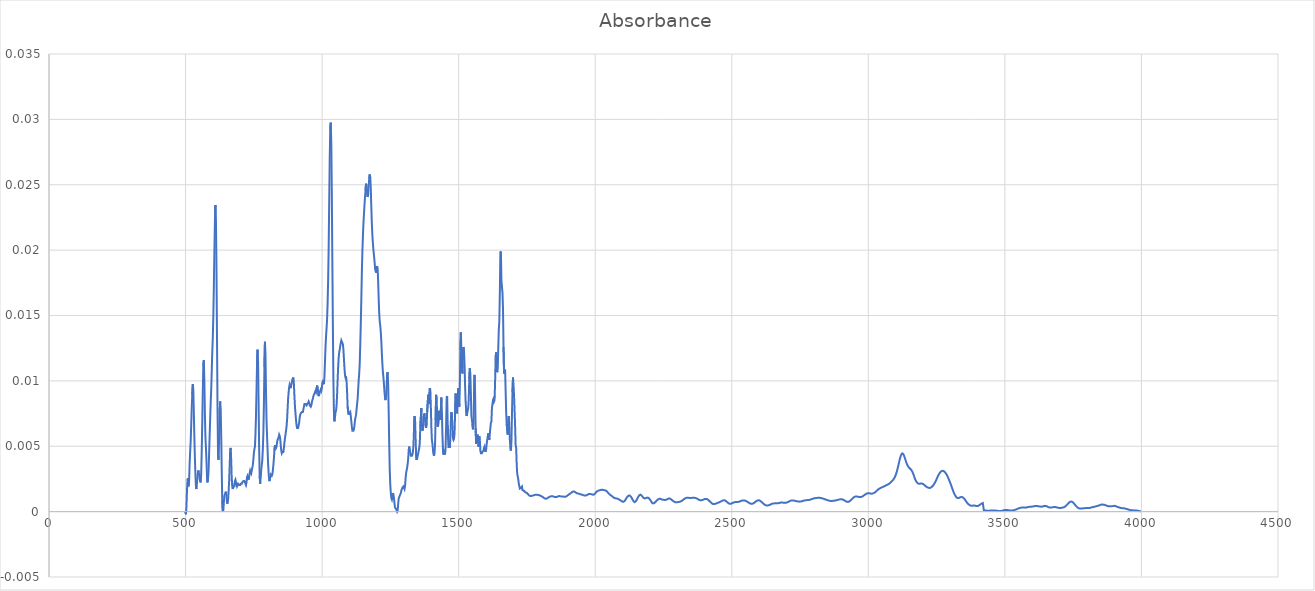
| Category | Absorbance |
|---|---|
| 3997.70514 | 0 |
| 3995.77668 | 0 |
| 3993.84822 | 0 |
| 3991.91975 | 0 |
| 3989.99129 | 0 |
| 3988.06283 | 0 |
| 3986.13436 | 0 |
| 3984.2059 | 0 |
| 3982.27743 | 0 |
| 3980.34897 | 0 |
| 3978.42051 | 0 |
| 3976.49204 | 0 |
| 3974.56358 | 0 |
| 3972.63512 | 0 |
| 3970.70665 | 0 |
| 3968.77819 | 0 |
| 3966.84973 | 0 |
| 3964.92126 | 0 |
| 3962.9928 | 0 |
| 3961.06433 | 0 |
| 3959.13587 | 0 |
| 3957.20741 | 0 |
| 3955.27894 | 0 |
| 3953.35048 | 0 |
| 3951.42202 | 0 |
| 3949.49355 | 0 |
| 3947.56509 | 0 |
| 3945.63663 | 0 |
| 3943.70816 | 0 |
| 3941.7797 | 0 |
| 3939.85123 | 0 |
| 3937.92277 | 0 |
| 3935.99431 | 0 |
| 3934.06584 | 0 |
| 3932.13738 | 0 |
| 3930.20892 | 0 |
| 3928.28045 | 0 |
| 3926.35199 | 0 |
| 3924.42353 | 0 |
| 3922.49506 | 0 |
| 3920.5666 | 0 |
| 3918.63813 | 0 |
| 3916.70967 | 0 |
| 3914.78121 | 0 |
| 3912.85274 | 0 |
| 3910.92428 | 0 |
| 3908.99582 | 0 |
| 3907.06735 | 0 |
| 3905.13889 | 0 |
| 3903.21043 | 0 |
| 3901.28196 | 0 |
| 3899.3535 | 0 |
| 3897.42503 | 0 |
| 3895.49657 | 0 |
| 3893.56811 | 0 |
| 3891.63964 | 0 |
| 3889.71118 | 0 |
| 3887.78272 | 0 |
| 3885.85425 | 0 |
| 3883.92579 | 0 |
| 3881.99733 | 0 |
| 3880.06886 | 0 |
| 3878.1404 | 0 |
| 3876.21193 | 0 |
| 3874.28347 | 0 |
| 3872.35501 | 0 |
| 3870.42654 | 0 |
| 3868.49808 | 0 |
| 3866.56962 | 0.001 |
| 3864.64115 | 0.001 |
| 3862.71269 | 0.001 |
| 3860.78422 | 0.001 |
| 3858.85576 | 0.001 |
| 3856.9273 | 0.001 |
| 3854.99883 | 0.001 |
| 3853.07037 | 0.001 |
| 3851.14191 | 0.001 |
| 3849.21344 | 0.001 |
| 3847.28498 | 0 |
| 3845.35652 | 0 |
| 3843.42805 | 0 |
| 3841.49959 | 0 |
| 3839.57112 | 0 |
| 3837.64266 | 0 |
| 3835.7142 | 0 |
| 3833.78573 | 0 |
| 3831.85727 | 0 |
| 3829.92881 | 0 |
| 3828.00034 | 0 |
| 3826.07188 | 0 |
| 3824.14342 | 0 |
| 3822.21495 | 0 |
| 3820.28649 | 0 |
| 3818.35802 | 0 |
| 3816.42956 | 0 |
| 3814.5011 | 0 |
| 3812.57263 | 0 |
| 3810.64417 | 0 |
| 3808.71571 | 0 |
| 3806.78724 | 0 |
| 3804.85878 | 0 |
| 3802.93032 | 0 |
| 3801.00185 | 0 |
| 3799.07339 | 0 |
| 3797.14492 | 0 |
| 3795.21646 | 0 |
| 3793.288 | 0 |
| 3791.35953 | 0 |
| 3789.43107 | 0 |
| 3787.50261 | 0 |
| 3785.57414 | 0 |
| 3783.64568 | 0 |
| 3781.71722 | 0 |
| 3779.78875 | 0 |
| 3777.86029 | 0 |
| 3775.93182 | 0 |
| 3774.00336 | 0 |
| 3772.0749 | 0 |
| 3770.14643 | 0 |
| 3768.21797 | 0 |
| 3766.28951 | 0 |
| 3764.36104 | 0 |
| 3762.43258 | 0 |
| 3760.50412 | 0 |
| 3758.57565 | 0 |
| 3756.64719 | 0.001 |
| 3754.71872 | 0.001 |
| 3752.79026 | 0.001 |
| 3750.8618 | 0.001 |
| 3748.93333 | 0.001 |
| 3747.00487 | 0.001 |
| 3745.07641 | 0.001 |
| 3743.14794 | 0.001 |
| 3741.21948 | 0.001 |
| 3739.29102 | 0.001 |
| 3737.36255 | 0.001 |
| 3735.43409 | 0.001 |
| 3733.50562 | 0.001 |
| 3731.57716 | 0.001 |
| 3729.6487 | 0.001 |
| 3727.72023 | 0.001 |
| 3725.79177 | 0 |
| 3723.86331 | 0 |
| 3721.93484 | 0 |
| 3720.00638 | 0 |
| 3718.07791 | 0 |
| 3716.14945 | 0 |
| 3714.22099 | 0 |
| 3712.29252 | 0 |
| 3710.36406 | 0 |
| 3708.4356 | 0 |
| 3706.50713 | 0 |
| 3704.57867 | 0 |
| 3702.65021 | 0 |
| 3700.72174 | 0 |
| 3698.79328 | 0 |
| 3696.86481 | 0 |
| 3694.93635 | 0 |
| 3693.00789 | 0 |
| 3691.07942 | 0 |
| 3689.15096 | 0 |
| 3687.2225 | 0 |
| 3685.29403 | 0 |
| 3683.36557 | 0 |
| 3681.43711 | 0 |
| 3679.50864 | 0 |
| 3677.58018 | 0 |
| 3675.65171 | 0 |
| 3673.72325 | 0 |
| 3671.79479 | 0 |
| 3669.86632 | 0 |
| 3667.93786 | 0 |
| 3666.0094 | 0 |
| 3664.08093 | 0 |
| 3662.15247 | 0 |
| 3660.22401 | 0 |
| 3658.29554 | 0 |
| 3656.36708 | 0 |
| 3654.43861 | 0 |
| 3652.51015 | 0 |
| 3650.58169 | 0 |
| 3648.65322 | 0 |
| 3646.72476 | 0 |
| 3644.7963 | 0 |
| 3642.86783 | 0 |
| 3640.93937 | 0 |
| 3639.01091 | 0 |
| 3637.08244 | 0 |
| 3635.15398 | 0 |
| 3633.22551 | 0 |
| 3631.29705 | 0 |
| 3629.36859 | 0 |
| 3627.44012 | 0 |
| 3625.51166 | 0 |
| 3623.5832 | 0 |
| 3621.65473 | 0 |
| 3619.72627 | 0 |
| 3617.79781 | 0 |
| 3615.86934 | 0 |
| 3613.94088 | 0 |
| 3612.01241 | 0 |
| 3610.08395 | 0 |
| 3608.15549 | 0 |
| 3606.22702 | 0 |
| 3604.29856 | 0 |
| 3602.3701 | 0 |
| 3600.44163 | 0 |
| 3598.51317 | 0 |
| 3596.58471 | 0 |
| 3594.65624 | 0 |
| 3592.72778 | 0 |
| 3590.79931 | 0 |
| 3588.87085 | 0 |
| 3586.94239 | 0 |
| 3585.01392 | 0 |
| 3583.08546 | 0 |
| 3581.157 | 0 |
| 3579.22853 | 0 |
| 3577.30007 | 0 |
| 3575.3716 | 0 |
| 3573.44314 | 0 |
| 3571.51468 | 0 |
| 3569.58621 | 0 |
| 3567.65775 | 0 |
| 3565.72929 | 0 |
| 3563.80082 | 0 |
| 3561.87236 | 0 |
| 3559.9439 | 0 |
| 3558.01543 | 0 |
| 3556.08697 | 0 |
| 3554.1585 | 0 |
| 3552.23004 | 0 |
| 3550.30158 | 0 |
| 3548.37311 | 0 |
| 3546.44465 | 0 |
| 3544.51619 | 0 |
| 3542.58772 | 0 |
| 3540.65926 | 0 |
| 3538.7308 | 0 |
| 3536.80233 | 0 |
| 3534.87387 | 0 |
| 3532.9454 | 0 |
| 3531.01694 | 0 |
| 3529.08848 | 0 |
| 3527.16001 | 0 |
| 3525.23155 | 0 |
| 3523.30309 | 0 |
| 3521.37462 | 0 |
| 3519.44616 | 0 |
| 3517.5177 | 0 |
| 3515.58923 | 0 |
| 3513.66077 | 0 |
| 3511.7323 | 0 |
| 3509.80384 | 0 |
| 3507.87538 | 0 |
| 3505.94691 | 0 |
| 3504.01845 | 0 |
| 3502.08999 | 0 |
| 3500.16152 | 0 |
| 3498.23306 | 0 |
| 3496.3046 | 0 |
| 3494.37613 | 0 |
| 3492.44767 | 0 |
| 3490.5192 | 0 |
| 3488.59074 | 0 |
| 3486.66228 | 0 |
| 3484.73381 | 0 |
| 3482.80535 | 0 |
| 3480.87689 | 0 |
| 3478.94842 | 0 |
| 3477.01996 | 0 |
| 3475.0915 | 0 |
| 3473.16303 | 0 |
| 3471.23457 | 0 |
| 3469.3061 | 0 |
| 3467.37764 | 0 |
| 3465.44918 | 0 |
| 3463.52071 | 0 |
| 3461.59225 | 0 |
| 3459.66379 | 0 |
| 3457.73532 | 0 |
| 3455.80686 | 0 |
| 3453.8784 | 0 |
| 3451.94993 | 0 |
| 3450.02147 | 0 |
| 3448.093 | 0 |
| 3446.16454 | 0 |
| 3444.23608 | 0 |
| 3442.30761 | 0 |
| 3440.37915 | 0 |
| 3438.45069 | 0 |
| 3436.52222 | 0 |
| 3434.59376 | 0 |
| 3432.66529 | 0 |
| 3430.73683 | 0 |
| 3428.80837 | 0 |
| 3426.8799 | 0 |
| 3424.95144 | 0 |
| 3423.02298 | 0 |
| 3421.09451 | 0 |
| 3419.16605 | 0.001 |
| 3417.23759 | 0.001 |
| 3415.30912 | 0.001 |
| 3413.38066 | 0.001 |
| 3411.45219 | 0.001 |
| 3409.52373 | 0.001 |
| 3407.59527 | 0.001 |
| 3405.6668 | 0 |
| 3403.73834 | 0 |
| 3401.80988 | 0 |
| 3399.88141 | 0 |
| 3397.95295 | 0 |
| 3396.02449 | 0 |
| 3394.09602 | 0 |
| 3392.16756 | 0 |
| 3390.23909 | 0 |
| 3388.31063 | 0 |
| 3386.38217 | 0 |
| 3384.4537 | 0 |
| 3382.52524 | 0 |
| 3380.59678 | 0 |
| 3378.66831 | 0 |
| 3376.73985 | 0 |
| 3374.81139 | 0 |
| 3372.88292 | 0 |
| 3370.95446 | 0.001 |
| 3369.02599 | 0.001 |
| 3367.09753 | 0.001 |
| 3365.16907 | 0.001 |
| 3363.2406 | 0.001 |
| 3361.31214 | 0.001 |
| 3359.38368 | 0.001 |
| 3357.45521 | 0.001 |
| 3355.52675 | 0.001 |
| 3353.59829 | 0.001 |
| 3351.66982 | 0.001 |
| 3349.74136 | 0.001 |
| 3347.81289 | 0.001 |
| 3345.88443 | 0.001 |
| 3343.95597 | 0.001 |
| 3342.0275 | 0.001 |
| 3340.09904 | 0.001 |
| 3338.17058 | 0.001 |
| 3336.24211 | 0.001 |
| 3334.31365 | 0.001 |
| 3332.38519 | 0.001 |
| 3330.45672 | 0.001 |
| 3328.52826 | 0.001 |
| 3326.59979 | 0.001 |
| 3324.67133 | 0.001 |
| 3322.74287 | 0.001 |
| 3320.8144 | 0.001 |
| 3318.88594 | 0.001 |
| 3316.95748 | 0.001 |
| 3315.02901 | 0.001 |
| 3313.10055 | 0.001 |
| 3311.17208 | 0.002 |
| 3309.24362 | 0.002 |
| 3307.31516 | 0.002 |
| 3305.38669 | 0.002 |
| 3303.45823 | 0.002 |
| 3301.52977 | 0.002 |
| 3299.6013 | 0.002 |
| 3297.67284 | 0.002 |
| 3295.74438 | 0.002 |
| 3293.81591 | 0.003 |
| 3291.88745 | 0.003 |
| 3289.95898 | 0.003 |
| 3288.03052 | 0.003 |
| 3286.10206 | 0.003 |
| 3284.17359 | 0.003 |
| 3282.24513 | 0.003 |
| 3280.31667 | 0.003 |
| 3278.3882 | 0.003 |
| 3276.45974 | 0.003 |
| 3274.53128 | 0.003 |
| 3272.60281 | 0.003 |
| 3270.67435 | 0.003 |
| 3268.74588 | 0.003 |
| 3266.81742 | 0.003 |
| 3264.88896 | 0.003 |
| 3262.96049 | 0.003 |
| 3261.03203 | 0.003 |
| 3259.10357 | 0.003 |
| 3257.1751 | 0.003 |
| 3255.24664 | 0.003 |
| 3253.31818 | 0.003 |
| 3251.38971 | 0.003 |
| 3249.46125 | 0.002 |
| 3247.53278 | 0.002 |
| 3245.60432 | 0.002 |
| 3243.67586 | 0.002 |
| 3241.74739 | 0.002 |
| 3239.81893 | 0.002 |
| 3237.89047 | 0.002 |
| 3235.962 | 0.002 |
| 3234.03354 | 0.002 |
| 3232.10508 | 0.002 |
| 3230.17661 | 0.002 |
| 3228.24815 | 0.002 |
| 3226.31968 | 0.002 |
| 3224.39122 | 0.002 |
| 3222.46276 | 0.002 |
| 3220.53429 | 0.002 |
| 3218.60583 | 0.002 |
| 3216.67737 | 0.002 |
| 3214.7489 | 0.002 |
| 3212.82044 | 0.002 |
| 3210.89198 | 0.002 |
| 3208.96351 | 0.002 |
| 3207.03505 | 0.002 |
| 3205.10658 | 0.002 |
| 3203.17812 | 0.002 |
| 3201.24966 | 0.002 |
| 3199.32119 | 0.002 |
| 3197.39273 | 0.002 |
| 3195.46427 | 0.002 |
| 3193.5358 | 0.002 |
| 3191.60734 | 0.002 |
| 3189.67888 | 0.002 |
| 3187.75041 | 0.002 |
| 3185.82195 | 0.002 |
| 3183.89348 | 0.002 |
| 3181.96502 | 0.002 |
| 3180.03656 | 0.002 |
| 3178.10809 | 0.002 |
| 3176.17963 | 0.002 |
| 3174.25117 | 0.002 |
| 3172.3227 | 0.002 |
| 3170.39424 | 0.003 |
| 3168.46577 | 0.003 |
| 3166.53731 | 0.003 |
| 3164.60885 | 0.003 |
| 3162.68038 | 0.003 |
| 3160.75192 | 0.003 |
| 3158.82346 | 0.003 |
| 3156.89499 | 0.003 |
| 3154.96653 | 0.003 |
| 3153.03807 | 0.003 |
| 3151.1096 | 0.003 |
| 3149.18114 | 0.003 |
| 3147.25267 | 0.003 |
| 3145.32421 | 0.003 |
| 3143.39575 | 0.004 |
| 3141.46728 | 0.004 |
| 3139.53882 | 0.004 |
| 3137.61036 | 0.004 |
| 3135.68189 | 0.004 |
| 3133.75343 | 0.004 |
| 3131.82497 | 0.004 |
| 3129.8965 | 0.004 |
| 3127.96804 | 0.004 |
| 3126.03957 | 0.004 |
| 3124.11111 | 0.004 |
| 3122.18265 | 0.004 |
| 3120.25418 | 0.004 |
| 3118.32572 | 0.004 |
| 3116.39726 | 0.004 |
| 3114.46879 | 0.004 |
| 3112.54033 | 0.004 |
| 3110.61187 | 0.004 |
| 3108.6834 | 0.003 |
| 3106.75494 | 0.003 |
| 3104.82647 | 0.003 |
| 3102.89801 | 0.003 |
| 3100.96955 | 0.003 |
| 3099.04108 | 0.003 |
| 3097.11262 | 0.003 |
| 3095.18416 | 0.003 |
| 3093.25569 | 0.003 |
| 3091.32723 | 0.002 |
| 3089.39877 | 0.002 |
| 3087.4703 | 0.002 |
| 3085.54184 | 0.002 |
| 3083.61337 | 0.002 |
| 3081.68491 | 0.002 |
| 3079.75645 | 0.002 |
| 3077.82798 | 0.002 |
| 3075.89952 | 0.002 |
| 3073.97106 | 0.002 |
| 3072.04259 | 0.002 |
| 3070.11413 | 0.002 |
| 3068.18567 | 0.002 |
| 3066.2572 | 0.002 |
| 3064.32874 | 0.002 |
| 3062.40027 | 0.002 |
| 3060.47181 | 0.002 |
| 3058.54335 | 0.002 |
| 3056.61488 | 0.002 |
| 3054.68642 | 0.002 |
| 3052.75796 | 0.002 |
| 3050.82949 | 0.002 |
| 3048.90103 | 0.002 |
| 3046.97257 | 0.002 |
| 3045.0441 | 0.002 |
| 3043.11564 | 0.002 |
| 3041.18717 | 0.002 |
| 3039.25871 | 0.002 |
| 3037.33025 | 0.002 |
| 3035.40178 | 0.002 |
| 3033.47332 | 0.002 |
| 3031.54486 | 0.002 |
| 3029.61639 | 0.002 |
| 3027.68793 | 0.002 |
| 3025.75946 | 0.001 |
| 3023.831 | 0.001 |
| 3021.90254 | 0.001 |
| 3019.97407 | 0.001 |
| 3018.04561 | 0.001 |
| 3016.11715 | 0.001 |
| 3014.18868 | 0.001 |
| 3012.26022 | 0.001 |
| 3010.33176 | 0.001 |
| 3008.40329 | 0.001 |
| 3006.47483 | 0.001 |
| 3004.54636 | 0.001 |
| 3002.6179 | 0.001 |
| 3000.68944 | 0.001 |
| 2998.76097 | 0.001 |
| 2996.83251 | 0.001 |
| 2994.90405 | 0.001 |
| 2992.97558 | 0.001 |
| 2991.04712 | 0.001 |
| 2989.11866 | 0.001 |
| 2987.19019 | 0.001 |
| 2985.26173 | 0.001 |
| 2983.33326 | 0.001 |
| 2981.4048 | 0.001 |
| 2979.47634 | 0.001 |
| 2977.54787 | 0.001 |
| 2975.61941 | 0.001 |
| 2973.69095 | 0.001 |
| 2971.76248 | 0.001 |
| 2969.83402 | 0.001 |
| 2967.90556 | 0.001 |
| 2965.97709 | 0.001 |
| 2964.04863 | 0.001 |
| 2962.12016 | 0.001 |
| 2960.1917 | 0.001 |
| 2958.26324 | 0.001 |
| 2956.33477 | 0.001 |
| 2954.40631 | 0.001 |
| 2952.47785 | 0.001 |
| 2950.54938 | 0.001 |
| 2948.62092 | 0.001 |
| 2946.69246 | 0.001 |
| 2944.76399 | 0.001 |
| 2942.83553 | 0.001 |
| 2940.90706 | 0.001 |
| 2938.9786 | 0.001 |
| 2937.05014 | 0.001 |
| 2935.12167 | 0.001 |
| 2933.19321 | 0.001 |
| 2931.26475 | 0.001 |
| 2929.33628 | 0.001 |
| 2927.40782 | 0.001 |
| 2925.47936 | 0.001 |
| 2923.55089 | 0.001 |
| 2921.62243 | 0.001 |
| 2919.69396 | 0.001 |
| 2917.7655 | 0.001 |
| 2915.83704 | 0.001 |
| 2913.90857 | 0.001 |
| 2911.98011 | 0.001 |
| 2910.05165 | 0.001 |
| 2908.12318 | 0.001 |
| 2906.19472 | 0.001 |
| 2904.26626 | 0.001 |
| 2902.33779 | 0.001 |
| 2900.40933 | 0.001 |
| 2898.48086 | 0.001 |
| 2896.5524 | 0.001 |
| 2894.62394 | 0.001 |
| 2892.69547 | 0.001 |
| 2890.76701 | 0.001 |
| 2888.83855 | 0.001 |
| 2886.91008 | 0.001 |
| 2884.98162 | 0.001 |
| 2883.05315 | 0.001 |
| 2881.12469 | 0.001 |
| 2879.19623 | 0.001 |
| 2877.26776 | 0.001 |
| 2875.3393 | 0.001 |
| 2873.41084 | 0.001 |
| 2871.48237 | 0.001 |
| 2869.55391 | 0.001 |
| 2867.62545 | 0.001 |
| 2865.69698 | 0.001 |
| 2863.76852 | 0.001 |
| 2861.84005 | 0.001 |
| 2859.91159 | 0.001 |
| 2857.98313 | 0.001 |
| 2856.05466 | 0.001 |
| 2854.1262 | 0.001 |
| 2852.19774 | 0.001 |
| 2850.26927 | 0.001 |
| 2848.34081 | 0.001 |
| 2846.41235 | 0.001 |
| 2844.48388 | 0.001 |
| 2842.55542 | 0.001 |
| 2840.62695 | 0.001 |
| 2838.69849 | 0.001 |
| 2836.77003 | 0.001 |
| 2834.84156 | 0.001 |
| 2832.9131 | 0.001 |
| 2830.98464 | 0.001 |
| 2829.05617 | 0.001 |
| 2827.12771 | 0.001 |
| 2825.19925 | 0.001 |
| 2823.27078 | 0.001 |
| 2821.34232 | 0.001 |
| 2819.41385 | 0.001 |
| 2817.48539 | 0.001 |
| 2815.55693 | 0.001 |
| 2813.62846 | 0.001 |
| 2811.7 | 0.001 |
| 2809.77154 | 0.001 |
| 2807.84307 | 0.001 |
| 2805.91461 | 0.001 |
| 2803.98615 | 0.001 |
| 2802.05768 | 0.001 |
| 2800.12922 | 0.001 |
| 2798.20075 | 0.001 |
| 2796.27229 | 0.001 |
| 2794.34383 | 0.001 |
| 2792.41536 | 0.001 |
| 2790.4869 | 0.001 |
| 2788.55844 | 0.001 |
| 2786.62997 | 0.001 |
| 2784.70151 | 0.001 |
| 2782.77305 | 0.001 |
| 2780.84458 | 0.001 |
| 2778.91612 | 0.001 |
| 2776.98765 | 0.001 |
| 2775.05919 | 0.001 |
| 2773.13073 | 0.001 |
| 2771.20226 | 0.001 |
| 2769.2738 | 0.001 |
| 2767.34534 | 0.001 |
| 2765.41687 | 0.001 |
| 2763.48841 | 0.001 |
| 2761.55995 | 0.001 |
| 2759.63148 | 0.001 |
| 2757.70302 | 0.001 |
| 2755.77455 | 0.001 |
| 2753.84609 | 0.001 |
| 2751.91763 | 0.001 |
| 2749.98916 | 0.001 |
| 2748.0607 | 0.001 |
| 2746.13224 | 0.001 |
| 2744.20377 | 0.001 |
| 2742.27531 | 0.001 |
| 2740.34684 | 0.001 |
| 2738.41838 | 0.001 |
| 2736.48992 | 0.001 |
| 2734.56145 | 0.001 |
| 2732.63299 | 0.001 |
| 2730.70453 | 0.001 |
| 2728.77606 | 0.001 |
| 2726.8476 | 0.001 |
| 2724.91914 | 0.001 |
| 2722.99067 | 0.001 |
| 2721.06221 | 0.001 |
| 2719.13374 | 0.001 |
| 2717.20528 | 0.001 |
| 2715.27682 | 0.001 |
| 2713.34835 | 0.001 |
| 2711.41989 | 0.001 |
| 2709.49143 | 0.001 |
| 2707.56296 | 0.001 |
| 2705.6345 | 0.001 |
| 2703.70604 | 0.001 |
| 2701.77757 | 0.001 |
| 2699.84911 | 0.001 |
| 2697.92064 | 0.001 |
| 2695.99218 | 0.001 |
| 2694.06372 | 0.001 |
| 2692.13525 | 0.001 |
| 2690.20679 | 0.001 |
| 2688.27833 | 0.001 |
| 2686.34986 | 0.001 |
| 2684.4214 | 0.001 |
| 2682.49294 | 0.001 |
| 2680.56447 | 0.001 |
| 2678.63601 | 0.001 |
| 2676.70754 | 0.001 |
| 2674.77908 | 0.001 |
| 2672.85062 | 0.001 |
| 2670.92215 | 0.001 |
| 2668.99369 | 0.001 |
| 2667.06523 | 0.001 |
| 2665.13676 | 0.001 |
| 2663.2083 | 0.001 |
| 2661.27984 | 0.001 |
| 2659.35137 | 0.001 |
| 2657.42291 | 0.001 |
| 2655.49444 | 0.001 |
| 2653.56598 | 0.001 |
| 2651.63752 | 0.001 |
| 2649.70905 | 0.001 |
| 2647.78059 | 0.001 |
| 2645.85213 | 0.001 |
| 2643.92366 | 0.001 |
| 2641.9952 | 0.001 |
| 2640.06674 | 0.001 |
| 2638.13827 | 0.001 |
| 2636.20981 | 0 |
| 2634.28134 | 0 |
| 2632.35288 | 0 |
| 2630.42442 | 0 |
| 2628.49595 | 0 |
| 2626.56749 | 0 |
| 2624.63903 | 0 |
| 2622.71056 | 0.001 |
| 2620.7821 | 0.001 |
| 2618.85364 | 0.001 |
| 2616.92517 | 0.001 |
| 2614.99671 | 0.001 |
| 2613.06824 | 0.001 |
| 2611.13978 | 0.001 |
| 2609.21132 | 0.001 |
| 2607.28285 | 0.001 |
| 2605.35439 | 0.001 |
| 2603.42593 | 0.001 |
| 2601.49746 | 0.001 |
| 2599.569 | 0.001 |
| 2597.64053 | 0.001 |
| 2595.71207 | 0.001 |
| 2593.78361 | 0.001 |
| 2591.85514 | 0.001 |
| 2589.92668 | 0.001 |
| 2587.99822 | 0.001 |
| 2586.06975 | 0.001 |
| 2584.14129 | 0.001 |
| 2582.21283 | 0.001 |
| 2580.28436 | 0.001 |
| 2578.3559 | 0.001 |
| 2576.42743 | 0.001 |
| 2574.49897 | 0.001 |
| 2572.57051 | 0.001 |
| 2570.64204 | 0.001 |
| 2568.71358 | 0.001 |
| 2566.78512 | 0.001 |
| 2564.85665 | 0.001 |
| 2562.92819 | 0.001 |
| 2560.99973 | 0.001 |
| 2559.07126 | 0.001 |
| 2557.1428 | 0.001 |
| 2555.21433 | 0.001 |
| 2553.28587 | 0.001 |
| 2551.35741 | 0.001 |
| 2549.42894 | 0.001 |
| 2547.50048 | 0.001 |
| 2545.57202 | 0.001 |
| 2543.64355 | 0.001 |
| 2541.71509 | 0.001 |
| 2539.78663 | 0.001 |
| 2537.85816 | 0.001 |
| 2535.9297 | 0.001 |
| 2534.00123 | 0.001 |
| 2532.07277 | 0.001 |
| 2530.14431 | 0.001 |
| 2528.21584 | 0.001 |
| 2526.28738 | 0.001 |
| 2524.35892 | 0.001 |
| 2522.43045 | 0.001 |
| 2520.50199 | 0.001 |
| 2518.57353 | 0.001 |
| 2516.64506 | 0.001 |
| 2514.7166 | 0.001 |
| 2512.78813 | 0.001 |
| 2510.85967 | 0.001 |
| 2508.93121 | 0.001 |
| 2507.00274 | 0.001 |
| 2505.07428 | 0.001 |
| 2503.14582 | 0.001 |
| 2501.21735 | 0.001 |
| 2499.28889 | 0.001 |
| 2497.36043 | 0.001 |
| 2495.43196 | 0.001 |
| 2493.5035 | 0.001 |
| 2491.57503 | 0.001 |
| 2489.64657 | 0.001 |
| 2487.71811 | 0.001 |
| 2485.78964 | 0.001 |
| 2483.86118 | 0.001 |
| 2481.93272 | 0.001 |
| 2480.00425 | 0.001 |
| 2478.07579 | 0.001 |
| 2476.14733 | 0.001 |
| 2474.21886 | 0.001 |
| 2472.2904 | 0.001 |
| 2470.36193 | 0.001 |
| 2468.43347 | 0.001 |
| 2466.50501 | 0.001 |
| 2464.57654 | 0.001 |
| 2462.64808 | 0.001 |
| 2460.71962 | 0.001 |
| 2458.79115 | 0.001 |
| 2456.86269 | 0.001 |
| 2454.93422 | 0.001 |
| 2453.00576 | 0.001 |
| 2451.0773 | 0.001 |
| 2449.14883 | 0.001 |
| 2447.22037 | 0.001 |
| 2445.29191 | 0.001 |
| 2443.36344 | 0.001 |
| 2441.43498 | 0.001 |
| 2439.50652 | 0.001 |
| 2437.57805 | 0.001 |
| 2435.64959 | 0.001 |
| 2433.72112 | 0.001 |
| 2431.79266 | 0.001 |
| 2429.8642 | 0.001 |
| 2427.93573 | 0.001 |
| 2426.00727 | 0.001 |
| 2424.07881 | 0.001 |
| 2422.15034 | 0.001 |
| 2420.22188 | 0.001 |
| 2418.29342 | 0.001 |
| 2416.36495 | 0.001 |
| 2414.43649 | 0.001 |
| 2412.50802 | 0.001 |
| 2410.57956 | 0.001 |
| 2408.6511 | 0.001 |
| 2406.72263 | 0.001 |
| 2404.79417 | 0.001 |
| 2402.86571 | 0.001 |
| 2400.93724 | 0.001 |
| 2399.00878 | 0.001 |
| 2397.08032 | 0.001 |
| 2395.15185 | 0.001 |
| 2393.22339 | 0.001 |
| 2391.29492 | 0.001 |
| 2389.36646 | 0.001 |
| 2387.438 | 0.001 |
| 2385.50953 | 0.001 |
| 2383.58107 | 0.001 |
| 2381.65261 | 0.001 |
| 2379.72414 | 0.001 |
| 2377.79568 | 0.001 |
| 2375.86722 | 0.001 |
| 2373.93875 | 0.001 |
| 2372.01029 | 0.001 |
| 2370.08182 | 0.001 |
| 2368.15336 | 0.001 |
| 2366.2249 | 0.001 |
| 2364.29643 | 0.001 |
| 2362.36797 | 0.001 |
| 2360.43951 | 0.001 |
| 2358.51104 | 0.001 |
| 2356.58258 | 0.001 |
| 2354.65412 | 0.001 |
| 2352.72565 | 0.001 |
| 2350.79719 | 0.001 |
| 2348.86872 | 0.001 |
| 2346.94026 | 0.001 |
| 2345.0118 | 0.001 |
| 2343.08333 | 0.001 |
| 2341.15487 | 0.001 |
| 2339.22641 | 0.001 |
| 2337.29794 | 0.001 |
| 2335.36948 | 0.001 |
| 2333.44102 | 0.001 |
| 2331.51255 | 0.001 |
| 2329.58409 | 0.001 |
| 2327.65562 | 0.001 |
| 2325.72716 | 0.001 |
| 2323.7987 | 0.001 |
| 2321.87023 | 0.001 |
| 2319.94177 | 0.001 |
| 2318.01331 | 0.001 |
| 2316.08484 | 0.001 |
| 2314.15638 | 0.001 |
| 2312.22791 | 0.001 |
| 2310.29945 | 0.001 |
| 2308.37099 | 0.001 |
| 2306.44252 | 0.001 |
| 2304.51406 | 0.001 |
| 2302.5856 | 0.001 |
| 2300.65713 | 0.001 |
| 2298.72867 | 0.001 |
| 2296.80021 | 0.001 |
| 2294.87174 | 0.001 |
| 2292.94328 | 0.001 |
| 2291.01481 | 0.001 |
| 2289.08635 | 0.001 |
| 2287.15789 | 0.001 |
| 2285.22942 | 0.001 |
| 2283.30096 | 0.001 |
| 2281.3725 | 0.001 |
| 2279.44403 | 0.001 |
| 2277.51557 | 0.001 |
| 2275.58711 | 0.001 |
| 2273.65864 | 0.001 |
| 2271.73018 | 0.001 |
| 2269.80171 | 0.001 |
| 2267.87325 | 0.001 |
| 2265.94479 | 0.001 |
| 2264.01632 | 0.001 |
| 2262.08786 | 0.001 |
| 2260.1594 | 0.001 |
| 2258.23093 | 0.001 |
| 2256.30247 | 0.001 |
| 2254.37401 | 0.001 |
| 2252.44554 | 0.001 |
| 2250.51708 | 0.001 |
| 2248.58861 | 0.001 |
| 2246.66015 | 0.001 |
| 2244.73169 | 0.001 |
| 2242.80322 | 0.001 |
| 2240.87476 | 0.001 |
| 2238.9463 | 0.001 |
| 2237.01783 | 0.001 |
| 2235.08937 | 0.001 |
| 2233.16091 | 0.001 |
| 2231.23244 | 0.001 |
| 2229.30398 | 0.001 |
| 2227.37551 | 0.001 |
| 2225.44705 | 0.001 |
| 2223.51859 | 0.001 |
| 2221.59012 | 0.001 |
| 2219.66166 | 0.001 |
| 2217.7332 | 0.001 |
| 2215.80473 | 0.001 |
| 2213.87627 | 0.001 |
| 2211.94781 | 0.001 |
| 2210.01934 | 0.001 |
| 2208.09088 | 0.001 |
| 2206.16241 | 0.001 |
| 2204.23395 | 0.001 |
| 2202.30549 | 0.001 |
| 2200.37702 | 0.001 |
| 2198.44856 | 0.001 |
| 2196.5201 | 0.001 |
| 2194.59163 | 0.001 |
| 2192.66317 | 0.001 |
| 2190.73471 | 0.001 |
| 2188.80624 | 0.001 |
| 2186.87778 | 0.001 |
| 2184.94931 | 0.001 |
| 2183.02085 | 0.001 |
| 2181.09239 | 0.001 |
| 2179.16392 | 0.001 |
| 2177.23546 | 0.001 |
| 2175.307 | 0.001 |
| 2173.37853 | 0.001 |
| 2171.45007 | 0.001 |
| 2169.5216 | 0.001 |
| 2167.59314 | 0.001 |
| 2165.66468 | 0.001 |
| 2163.73621 | 0.001 |
| 2161.80775 | 0.001 |
| 2159.87929 | 0.001 |
| 2157.95082 | 0.001 |
| 2156.02236 | 0.001 |
| 2154.0939 | 0.001 |
| 2152.16543 | 0.001 |
| 2150.23697 | 0.001 |
| 2148.3085 | 0.001 |
| 2146.38004 | 0.001 |
| 2144.45158 | 0.001 |
| 2142.52311 | 0.001 |
| 2140.59465 | 0.001 |
| 2138.66619 | 0.001 |
| 2136.73772 | 0.001 |
| 2134.80926 | 0.001 |
| 2132.8808 | 0.001 |
| 2130.95233 | 0.001 |
| 2129.02387 | 0.001 |
| 2127.0954 | 0.001 |
| 2125.16694 | 0.001 |
| 2123.23848 | 0.001 |
| 2121.31001 | 0.001 |
| 2119.38155 | 0.001 |
| 2117.45309 | 0.001 |
| 2115.52462 | 0.001 |
| 2113.59616 | 0.001 |
| 2111.6677 | 0.001 |
| 2109.73923 | 0.001 |
| 2107.81077 | 0.001 |
| 2105.8823 | 0.001 |
| 2103.95384 | 0.001 |
| 2102.02538 | 0.001 |
| 2100.09691 | 0.001 |
| 2098.16845 | 0.001 |
| 2096.23999 | 0.001 |
| 2094.31152 | 0.001 |
| 2092.38306 | 0.001 |
| 2090.4546 | 0.001 |
| 2088.52613 | 0.001 |
| 2086.59767 | 0.001 |
| 2084.6692 | 0.001 |
| 2082.74074 | 0.001 |
| 2080.81228 | 0.001 |
| 2078.88381 | 0.001 |
| 2076.95535 | 0.001 |
| 2075.02689 | 0.001 |
| 2073.09842 | 0.001 |
| 2071.16996 | 0.001 |
| 2069.2415 | 0.001 |
| 2067.31303 | 0.001 |
| 2065.38457 | 0.001 |
| 2063.4561 | 0.001 |
| 2061.52764 | 0.001 |
| 2059.59918 | 0.001 |
| 2057.67071 | 0.001 |
| 2055.74225 | 0.001 |
| 2053.81379 | 0.001 |
| 2051.88532 | 0.001 |
| 2049.95686 | 0.001 |
| 2048.0284 | 0.001 |
| 2046.09993 | 0.001 |
| 2044.17147 | 0.002 |
| 2042.243 | 0.002 |
| 2040.31454 | 0.002 |
| 2038.38608 | 0.002 |
| 2036.45761 | 0.002 |
| 2034.52915 | 0.002 |
| 2032.60069 | 0.002 |
| 2030.67222 | 0.002 |
| 2028.74376 | 0.002 |
| 2026.81529 | 0.002 |
| 2024.88683 | 0.002 |
| 2022.95837 | 0.002 |
| 2021.0299 | 0.002 |
| 2019.10144 | 0.002 |
| 2017.17298 | 0.002 |
| 2015.24451 | 0.002 |
| 2013.31605 | 0.002 |
| 2011.38759 | 0.002 |
| 2009.45912 | 0.002 |
| 2007.53066 | 0.002 |
| 2005.60219 | 0.002 |
| 2003.67373 | 0.001 |
| 2001.74527 | 0.001 |
| 1999.8168 | 0.001 |
| 1997.88834 | 0.001 |
| 1995.95988 | 0.001 |
| 1994.03141 | 0.001 |
| 1992.10295 | 0.001 |
| 1990.17449 | 0.001 |
| 1988.24602 | 0.001 |
| 1986.31756 | 0.001 |
| 1984.38909 | 0.001 |
| 1982.46063 | 0.001 |
| 1980.53217 | 0.001 |
| 1978.6037 | 0.001 |
| 1976.67524 | 0.001 |
| 1974.74678 | 0.001 |
| 1972.81831 | 0.001 |
| 1970.88985 | 0.001 |
| 1968.96139 | 0.001 |
| 1967.03292 | 0.001 |
| 1965.10446 | 0.001 |
| 1963.17599 | 0.001 |
| 1961.24753 | 0.001 |
| 1959.31907 | 0.001 |
| 1957.3906 | 0.001 |
| 1955.46214 | 0.001 |
| 1953.53368 | 0.001 |
| 1951.60521 | 0.001 |
| 1949.67675 | 0.001 |
| 1947.74829 | 0.001 |
| 1945.81982 | 0.001 |
| 1943.89136 | 0.001 |
| 1941.96289 | 0.001 |
| 1940.03443 | 0.001 |
| 1938.10597 | 0.001 |
| 1936.1775 | 0.001 |
| 1934.24904 | 0.001 |
| 1932.32058 | 0.001 |
| 1930.39211 | 0.001 |
| 1928.46365 | 0.001 |
| 1926.53519 | 0.001 |
| 1924.60672 | 0.002 |
| 1922.67826 | 0.002 |
| 1920.74979 | 0.002 |
| 1918.82133 | 0.002 |
| 1916.89287 | 0.002 |
| 1914.9644 | 0.001 |
| 1913.03594 | 0.001 |
| 1911.10748 | 0.001 |
| 1909.17901 | 0.001 |
| 1907.25055 | 0.001 |
| 1905.32209 | 0.001 |
| 1903.39362 | 0.001 |
| 1901.46516 | 0.001 |
| 1899.53669 | 0.001 |
| 1897.60823 | 0.001 |
| 1895.67977 | 0.001 |
| 1893.7513 | 0.001 |
| 1891.82284 | 0.001 |
| 1889.89438 | 0.001 |
| 1887.96591 | 0.001 |
| 1886.03745 | 0.001 |
| 1884.10898 | 0.001 |
| 1882.18052 | 0.001 |
| 1880.25206 | 0.001 |
| 1878.32359 | 0.001 |
| 1876.39513 | 0.001 |
| 1874.46667 | 0.001 |
| 1872.5382 | 0.001 |
| 1870.60974 | 0.001 |
| 1868.68128 | 0.001 |
| 1866.75281 | 0.001 |
| 1864.82435 | 0.001 |
| 1862.89588 | 0.001 |
| 1860.96742 | 0.001 |
| 1859.03896 | 0.001 |
| 1857.11049 | 0.001 |
| 1855.18203 | 0.001 |
| 1853.25357 | 0.001 |
| 1851.3251 | 0.001 |
| 1849.39664 | 0.001 |
| 1847.46818 | 0.001 |
| 1845.53971 | 0.001 |
| 1843.61125 | 0.001 |
| 1841.68278 | 0.001 |
| 1839.75432 | 0.001 |
| 1837.82586 | 0.001 |
| 1835.89739 | 0.001 |
| 1833.96893 | 0.001 |
| 1832.04047 | 0.001 |
| 1830.112 | 0.001 |
| 1828.18354 | 0.001 |
| 1826.25508 | 0.001 |
| 1824.32661 | 0.001 |
| 1822.39815 | 0.001 |
| 1820.46968 | 0.001 |
| 1818.54122 | 0.001 |
| 1816.61276 | 0.001 |
| 1814.68429 | 0.001 |
| 1812.75583 | 0.001 |
| 1810.82737 | 0.001 |
| 1808.8989 | 0.001 |
| 1806.97044 | 0.001 |
| 1805.04198 | 0.001 |
| 1803.11351 | 0.001 |
| 1801.18505 | 0.001 |
| 1799.25658 | 0.001 |
| 1797.32812 | 0.001 |
| 1795.39966 | 0.001 |
| 1793.47119 | 0.001 |
| 1791.54273 | 0.001 |
| 1789.61427 | 0.001 |
| 1787.6858 | 0.001 |
| 1785.75734 | 0.001 |
| 1783.82888 | 0.001 |
| 1781.90041 | 0.001 |
| 1779.97195 | 0.001 |
| 1778.04348 | 0.001 |
| 1776.11502 | 0.001 |
| 1774.18656 | 0.001 |
| 1772.25809 | 0.001 |
| 1770.32963 | 0.001 |
| 1768.40117 | 0.001 |
| 1766.4727 | 0.001 |
| 1764.54424 | 0.001 |
| 1762.61578 | 0.001 |
| 1760.68731 | 0.001 |
| 1758.75885 | 0.001 |
| 1756.83038 | 0.001 |
| 1754.90192 | 0.001 |
| 1752.97346 | 0.001 |
| 1751.04499 | 0.001 |
| 1749.11653 | 0.001 |
| 1747.18807 | 0.001 |
| 1745.2596 | 0.001 |
| 1743.33114 | 0.001 |
| 1741.40267 | 0.002 |
| 1739.47421 | 0.002 |
| 1737.54575 | 0.002 |
| 1735.61728 | 0.002 |
| 1733.68882 | 0.002 |
| 1731.76036 | 0.002 |
| 1729.83189 | 0.002 |
| 1727.90343 | 0.002 |
| 1725.97497 | 0.002 |
| 1724.0465 | 0.002 |
| 1722.11804 | 0.002 |
| 1720.18957 | 0.002 |
| 1718.26111 | 0.002 |
| 1716.33265 | 0.003 |
| 1714.40418 | 0.003 |
| 1712.47572 | 0.004 |
| 1710.54726 | 0.005 |
| 1708.61879 | 0.005 |
| 1706.69033 | 0.007 |
| 1704.76187 | 0.008 |
| 1702.8334 | 0.009 |
| 1700.90494 | 0.01 |
| 1698.97647 | 0.01 |
| 1697.04801 | 0.009 |
| 1695.11955 | 0.007 |
| 1693.19108 | 0.005 |
| 1691.26262 | 0.005 |
| 1689.33416 | 0.005 |
| 1687.40569 | 0.005 |
| 1685.47723 | 0.007 |
| 1683.54877 | 0.007 |
| 1681.6203 | 0.007 |
| 1679.69184 | 0.006 |
| 1677.76337 | 0.006 |
| 1675.83491 | 0.007 |
| 1673.90645 | 0.008 |
| 1671.97798 | 0.009 |
| 1670.04952 | 0.011 |
| 1668.12106 | 0.011 |
| 1666.19259 | 0.011 |
| 1664.26413 | 0.013 |
| 1662.33567 | 0.016 |
| 1660.4072 | 0.017 |
| 1658.47874 | 0.017 |
| 1656.55027 | 0.018 |
| 1654.62181 | 0.02 |
| 1652.69335 | 0.02 |
| 1650.76488 | 0.017 |
| 1648.83642 | 0.015 |
| 1646.90796 | 0.014 |
| 1644.97949 | 0.012 |
| 1643.05103 | 0.011 |
| 1641.12257 | 0.011 |
| 1639.1941 | 0.011 |
| 1637.26564 | 0.012 |
| 1635.33717 | 0.012 |
| 1633.40871 | 0.01 |
| 1631.48025 | 0.009 |
| 1629.55178 | 0.008 |
| 1627.62332 | 0.009 |
| 1625.69486 | 0.009 |
| 1623.76639 | 0.009 |
| 1621.83793 | 0.008 |
| 1619.90946 | 0.007 |
| 1617.981 | 0.007 |
| 1616.05254 | 0.007 |
| 1614.12407 | 0.006 |
| 1612.19561 | 0.005 |
| 1610.26715 | 0.006 |
| 1608.33868 | 0.006 |
| 1606.41022 | 0.006 |
| 1604.48176 | 0.005 |
| 1602.55329 | 0.005 |
| 1600.62483 | 0.005 |
| 1598.69636 | 0.005 |
| 1596.7679 | 0.005 |
| 1594.83944 | 0.005 |
| 1592.91097 | 0.005 |
| 1590.98251 | 0.005 |
| 1589.05405 | 0.005 |
| 1587.12558 | 0.005 |
| 1585.19712 | 0.004 |
| 1583.26866 | 0.004 |
| 1581.34019 | 0.004 |
| 1579.41173 | 0.005 |
| 1577.48326 | 0.005 |
| 1575.5548 | 0.006 |
| 1573.62634 | 0.005 |
| 1571.69787 | 0.005 |
| 1569.76941 | 0.006 |
| 1567.84095 | 0.006 |
| 1565.91248 | 0.005 |
| 1563.98402 | 0.005 |
| 1562.05556 | 0.006 |
| 1560.12709 | 0.009 |
| 1558.19863 | 0.01 |
| 1556.27016 | 0.009 |
| 1554.3417 | 0.007 |
| 1552.41324 | 0.006 |
| 1550.48477 | 0.007 |
| 1548.55631 | 0.007 |
| 1546.62785 | 0.007 |
| 1544.69938 | 0.009 |
| 1542.77092 | 0.011 |
| 1540.84246 | 0.011 |
| 1538.91399 | 0.01 |
| 1536.98553 | 0.009 |
| 1535.05706 | 0.008 |
| 1533.1286 | 0.008 |
| 1531.20014 | 0.008 |
| 1529.27167 | 0.007 |
| 1527.34321 | 0.008 |
| 1525.41475 | 0.008 |
| 1523.48628 | 0.01 |
| 1521.55782 | 0.011 |
| 1519.62936 | 0.012 |
| 1517.70089 | 0.013 |
| 1515.77243 | 0.012 |
| 1513.84396 | 0.011 |
| 1511.9155 | 0.011 |
| 1509.98704 | 0.012 |
| 1508.05857 | 0.014 |
| 1506.13011 | 0.012 |
| 1504.20165 | 0.009 |
| 1502.27318 | 0.008 |
| 1500.34472 | 0.009 |
| 1498.41626 | 0.009 |
| 1496.48779 | 0.009 |
| 1494.55933 | 0.008 |
| 1492.63086 | 0.008 |
| 1490.7024 | 0.009 |
| 1488.77394 | 0.009 |
| 1486.84547 | 0.007 |
| 1484.91701 | 0.006 |
| 1482.98855 | 0.006 |
| 1481.06008 | 0.005 |
| 1479.13162 | 0.006 |
| 1477.20315 | 0.006 |
| 1475.27469 | 0.007 |
| 1473.34623 | 0.008 |
| 1471.41776 | 0.007 |
| 1469.4893 | 0.006 |
| 1467.56084 | 0.005 |
| 1465.63237 | 0.005 |
| 1463.70391 | 0.005 |
| 1461.77545 | 0.005 |
| 1459.84698 | 0.007 |
| 1457.91852 | 0.009 |
| 1455.99005 | 0.009 |
| 1454.06159 | 0.007 |
| 1452.13313 | 0.005 |
| 1450.20466 | 0.004 |
| 1448.2762 | 0.005 |
| 1446.34774 | 0.004 |
| 1444.41927 | 0.004 |
| 1442.49081 | 0.005 |
| 1440.56235 | 0.006 |
| 1438.63388 | 0.008 |
| 1436.70542 | 0.009 |
| 1434.77695 | 0.008 |
| 1432.84849 | 0.007 |
| 1430.92003 | 0.008 |
| 1428.99156 | 0.008 |
| 1427.0631 | 0.007 |
| 1425.13464 | 0.007 |
| 1423.20617 | 0.006 |
| 1421.27771 | 0.007 |
| 1419.34925 | 0.009 |
| 1417.42078 | 0.009 |
| 1415.49232 | 0.007 |
| 1413.56385 | 0.005 |
| 1411.63539 | 0.004 |
| 1409.70693 | 0.004 |
| 1407.77846 | 0.004 |
| 1405.85 | 0.005 |
| 1403.92154 | 0.005 |
| 1401.99307 | 0.005 |
| 1400.06461 | 0.006 |
| 1398.13615 | 0.008 |
| 1396.20768 | 0.009 |
| 1394.27922 | 0.009 |
| 1392.35075 | 0.009 |
| 1390.42229 | 0.008 |
| 1388.49383 | 0.009 |
| 1386.56536 | 0.009 |
| 1384.6369 | 0.008 |
| 1382.70844 | 0.007 |
| 1380.77997 | 0.006 |
| 1378.85151 | 0.007 |
| 1376.92305 | 0.007 |
| 1374.99458 | 0.008 |
| 1373.06612 | 0.007 |
| 1371.13765 | 0.007 |
| 1369.20919 | 0.006 |
| 1367.28073 | 0.006 |
| 1365.35226 | 0.007 |
| 1363.4238 | 0.008 |
| 1361.49534 | 0.008 |
| 1359.56687 | 0.006 |
| 1357.63841 | 0.005 |
| 1355.70995 | 0.005 |
| 1353.78148 | 0.005 |
| 1351.85302 | 0.004 |
| 1349.92455 | 0.004 |
| 1347.99609 | 0.004 |
| 1346.06763 | 0.004 |
| 1344.13916 | 0.004 |
| 1342.2107 | 0.006 |
| 1340.28224 | 0.007 |
| 1338.35377 | 0.007 |
| 1336.42531 | 0.006 |
| 1334.49684 | 0.005 |
| 1332.56838 | 0.005 |
| 1330.63992 | 0.004 |
| 1328.71145 | 0.004 |
| 1326.78299 | 0.004 |
| 1324.85453 | 0.004 |
| 1322.92606 | 0.004 |
| 1320.9976 | 0.005 |
| 1319.06914 | 0.005 |
| 1317.14067 | 0.005 |
| 1315.21221 | 0.004 |
| 1313.28374 | 0.004 |
| 1311.35528 | 0.003 |
| 1309.42682 | 0.003 |
| 1307.49835 | 0.003 |
| 1305.56989 | 0.003 |
| 1303.64143 | 0.002 |
| 1301.71296 | 0.002 |
| 1299.7845 | 0.002 |
| 1297.85604 | 0.002 |
| 1295.92757 | 0.002 |
| 1293.99911 | 0.002 |
| 1292.07064 | 0.002 |
| 1290.14218 | 0.002 |
| 1288.21372 | 0.001 |
| 1286.28525 | 0.001 |
| 1284.35679 | 0.001 |
| 1282.42833 | 0.001 |
| 1280.49986 | 0.001 |
| 1278.5714 | 0.001 |
| 1276.64294 | 0 |
| 1274.71447 | 0 |
| 1272.78601 | 0 |
| 1270.85754 | 0 |
| 1268.92908 | 0 |
| 1267.00062 | 0 |
| 1265.07215 | 0.001 |
| 1263.14369 | 0.001 |
| 1261.21523 | 0.001 |
| 1259.28676 | 0.001 |
| 1257.3583 | 0.001 |
| 1255.42984 | 0.001 |
| 1253.50137 | 0.001 |
| 1251.57291 | 0.001 |
| 1249.64444 | 0.002 |
| 1247.71598 | 0.003 |
| 1245.78752 | 0.005 |
| 1243.85905 | 0.008 |
| 1241.93059 | 0.01 |
| 1240.00213 | 0.011 |
| 1238.07366 | 0.01 |
| 1236.1452 | 0.01 |
| 1234.21674 | 0.009 |
| 1232.28827 | 0.009 |
| 1230.35981 | 0.009 |
| 1228.43134 | 0.009 |
| 1226.50288 | 0.01 |
| 1224.57442 | 0.01 |
| 1222.64595 | 0.011 |
| 1220.71749 | 0.011 |
| 1218.78903 | 0.012 |
| 1216.86056 | 0.013 |
| 1214.9321 | 0.014 |
| 1213.00364 | 0.014 |
| 1211.07517 | 0.015 |
| 1209.14671 | 0.015 |
| 1207.21824 | 0.016 |
| 1205.28978 | 0.018 |
| 1203.36132 | 0.019 |
| 1201.43285 | 0.019 |
| 1199.50439 | 0.019 |
| 1197.57593 | 0.018 |
| 1195.64746 | 0.018 |
| 1193.719 | 0.019 |
| 1191.79053 | 0.019 |
| 1189.86207 | 0.02 |
| 1187.93361 | 0.02 |
| 1186.00514 | 0.021 |
| 1184.07668 | 0.021 |
| 1182.14822 | 0.022 |
| 1180.21975 | 0.023 |
| 1178.29129 | 0.025 |
| 1176.36283 | 0.026 |
| 1174.43436 | 0.026 |
| 1172.5059 | 0.025 |
| 1170.57743 | 0.025 |
| 1168.64897 | 0.024 |
| 1166.72051 | 0.024 |
| 1164.79204 | 0.024 |
| 1162.86358 | 0.025 |
| 1160.93512 | 0.025 |
| 1159.00665 | 0.025 |
| 1157.07819 | 0.024 |
| 1155.14973 | 0.023 |
| 1153.22126 | 0.023 |
| 1151.2928 | 0.022 |
| 1149.36433 | 0.021 |
| 1147.43587 | 0.02 |
| 1145.50741 | 0.018 |
| 1143.57894 | 0.016 |
| 1141.65048 | 0.014 |
| 1139.72202 | 0.013 |
| 1137.79355 | 0.011 |
| 1135.86509 | 0.011 |
| 1133.93663 | 0.01 |
| 1132.00816 | 0.009 |
| 1130.0797 | 0.009 |
| 1128.15123 | 0.008 |
| 1126.22277 | 0.008 |
| 1124.29431 | 0.007 |
| 1122.36584 | 0.007 |
| 1120.43738 | 0.007 |
| 1118.50892 | 0.007 |
| 1116.58045 | 0.006 |
| 1114.65199 | 0.006 |
| 1112.72353 | 0.006 |
| 1110.79506 | 0.006 |
| 1108.8666 | 0.006 |
| 1106.93813 | 0.007 |
| 1105.00967 | 0.007 |
| 1103.08121 | 0.008 |
| 1101.15274 | 0.008 |
| 1099.22428 | 0.008 |
| 1097.29582 | 0.007 |
| 1095.36735 | 0.007 |
| 1093.43889 | 0.008 |
| 1091.51043 | 0.009 |
| 1089.58196 | 0.01 |
| 1087.6535 | 0.01 |
| 1085.72503 | 0.01 |
| 1083.79657 | 0.01 |
| 1081.86811 | 0.011 |
| 1079.93964 | 0.012 |
| 1078.01118 | 0.012 |
| 1076.08272 | 0.013 |
| 1074.15425 | 0.013 |
| 1072.22579 | 0.013 |
| 1070.29733 | 0.013 |
| 1068.36886 | 0.013 |
| 1066.4404 | 0.013 |
| 1064.51193 | 0.012 |
| 1062.58347 | 0.012 |
| 1060.65501 | 0.012 |
| 1058.72654 | 0.011 |
| 1056.79808 | 0.01 |
| 1054.86962 | 0.009 |
| 1052.94115 | 0.008 |
| 1051.01269 | 0.008 |
| 1049.08422 | 0.008 |
| 1047.15576 | 0.007 |
| 1045.2273 | 0.007 |
| 1043.29883 | 0.008 |
| 1041.37037 | 0.01 |
| 1039.44191 | 0.014 |
| 1037.51344 | 0.019 |
| 1035.58498 | 0.024 |
| 1033.65652 | 0.028 |
| 1031.72805 | 0.03 |
| 1029.79959 | 0.029 |
| 1027.87112 | 0.027 |
| 1025.94266 | 0.024 |
| 1024.0142 | 0.02 |
| 1022.08573 | 0.018 |
| 1020.15727 | 0.016 |
| 1018.22881 | 0.015 |
| 1016.30034 | 0.014 |
| 1014.37188 | 0.013 |
| 1012.44342 | 0.013 |
| 1010.51495 | 0.011 |
| 1008.58649 | 0.01 |
| 1006.65802 | 0.01 |
| 1004.72956 | 0.01 |
| 1002.8011 | 0.01 |
| 1000.87263 | 0.01 |
| 998.94417 | 0.009 |
| 997.01571 | 0.009 |
| 995.08724 | 0.009 |
| 993.15878 | 0.009 |
| 991.23032 | 0.009 |
| 989.30185 | 0.009 |
| 987.37339 | 0.009 |
| 985.44492 | 0.009 |
| 983.51646 | 0.01 |
| 981.588 | 0.01 |
| 979.65953 | 0.009 |
| 977.73107 | 0.009 |
| 975.80261 | 0.009 |
| 973.87414 | 0.009 |
| 971.94568 | 0.009 |
| 970.01722 | 0.009 |
| 968.08875 | 0.009 |
| 966.16029 | 0.009 |
| 964.23182 | 0.009 |
| 962.30336 | 0.008 |
| 960.3749 | 0.008 |
| 958.44643 | 0.008 |
| 956.51797 | 0.008 |
| 954.58951 | 0.008 |
| 952.66104 | 0.008 |
| 950.73258 | 0.008 |
| 948.80412 | 0.008 |
| 946.87565 | 0.008 |
| 944.94719 | 0.008 |
| 943.01872 | 0.008 |
| 941.09026 | 0.008 |
| 939.1618 | 0.008 |
| 937.23333 | 0.008 |
| 935.30487 | 0.008 |
| 933.37641 | 0.008 |
| 931.44794 | 0.008 |
| 929.51948 | 0.008 |
| 927.59102 | 0.008 |
| 925.66255 | 0.008 |
| 923.73409 | 0.008 |
| 921.80562 | 0.008 |
| 919.87716 | 0.007 |
| 917.9487 | 0.007 |
| 916.02023 | 0.007 |
| 914.09177 | 0.007 |
| 912.16331 | 0.006 |
| 910.23484 | 0.006 |
| 908.30638 | 0.006 |
| 906.37791 | 0.007 |
| 904.44945 | 0.007 |
| 902.52099 | 0.008 |
| 900.59252 | 0.008 |
| 898.66406 | 0.009 |
| 896.7356 | 0.01 |
| 894.80713 | 0.01 |
| 892.87867 | 0.01 |
| 890.95021 | 0.01 |
| 889.02174 | 0.01 |
| 887.09328 | 0.01 |
| 885.16481 | 0.009 |
| 883.23635 | 0.01 |
| 881.30789 | 0.01 |
| 879.37942 | 0.01 |
| 877.45096 | 0.009 |
| 875.5225 | 0.009 |
| 873.59403 | 0.008 |
| 871.66557 | 0.007 |
| 869.73711 | 0.006 |
| 867.80864 | 0.006 |
| 865.88018 | 0.006 |
| 863.95171 | 0.006 |
| 862.02325 | 0.005 |
| 860.09479 | 0.005 |
| 858.16632 | 0.005 |
| 856.23786 | 0.005 |
| 854.3094 | 0.005 |
| 852.38093 | 0.004 |
| 850.45247 | 0.005 |
| 848.52401 | 0.005 |
| 846.59554 | 0.006 |
| 844.66708 | 0.006 |
| 842.73861 | 0.006 |
| 840.81015 | 0.006 |
| 838.88169 | 0.006 |
| 836.95322 | 0.005 |
| 835.02476 | 0.005 |
| 833.0963 | 0.005 |
| 831.16783 | 0.005 |
| 829.23937 | 0.005 |
| 827.31091 | 0.005 |
| 825.38244 | 0.005 |
| 823.45398 | 0.004 |
| 821.52551 | 0.004 |
| 819.59705 | 0.003 |
| 817.66859 | 0.003 |
| 815.74012 | 0.003 |
| 813.81166 | 0.003 |
| 811.8832 | 0.003 |
| 809.95473 | 0.003 |
| 808.02627 | 0.002 |
| 806.09781 | 0.002 |
| 804.16934 | 0.003 |
| 802.24088 | 0.004 |
| 800.31241 | 0.005 |
| 798.38395 | 0.006 |
| 796.45549 | 0.007 |
| 794.52702 | 0.009 |
| 792.59856 | 0.012 |
| 790.6701 | 0.013 |
| 788.74163 | 0.011 |
| 786.81317 | 0.008 |
| 784.88471 | 0.006 |
| 782.95624 | 0.005 |
| 781.02778 | 0.004 |
| 779.09931 | 0.004 |
| 777.17085 | 0.003 |
| 775.24239 | 0.003 |
| 773.31392 | 0.002 |
| 771.38546 | 0.003 |
| 769.457 | 0.005 |
| 767.52853 | 0.008 |
| 765.60007 | 0.011 |
| 763.6716 | 0.012 |
| 761.74314 | 0.011 |
| 759.81468 | 0.009 |
| 757.88621 | 0.007 |
| 755.95775 | 0.006 |
| 754.02929 | 0.005 |
| 752.10082 | 0.005 |
| 750.17236 | 0.004 |
| 748.2439 | 0.004 |
| 746.31543 | 0.004 |
| 744.38697 | 0.003 |
| 742.4585 | 0.003 |
| 740.53004 | 0.003 |
| 738.60158 | 0.003 |
| 736.67311 | 0.003 |
| 734.74465 | 0.003 |
| 732.81619 | 0.003 |
| 730.88772 | 0.002 |
| 728.95926 | 0.002 |
| 727.0308 | 0.003 |
| 725.10233 | 0.003 |
| 723.17387 | 0.002 |
| 721.2454 | 0.002 |
| 719.31694 | 0.002 |
| 717.38848 | 0.002 |
| 715.46001 | 0.002 |
| 713.53155 | 0.002 |
| 711.60309 | 0.002 |
| 709.67462 | 0.002 |
| 707.74616 | 0.002 |
| 705.8177 | 0.002 |
| 703.88923 | 0.002 |
| 701.96077 | 0.002 |
| 700.0323 | 0.002 |
| 698.10384 | 0.002 |
| 696.17538 | 0.002 |
| 694.24691 | 0.002 |
| 692.31845 | 0.002 |
| 690.38999 | 0.002 |
| 688.46152 | 0.002 |
| 686.53306 | 0.002 |
| 684.6046 | 0.002 |
| 682.67613 | 0.002 |
| 680.74767 | 0.002 |
| 678.8192 | 0.002 |
| 676.89074 | 0.002 |
| 674.96228 | 0.002 |
| 673.03381 | 0.002 |
| 671.10535 | 0.002 |
| 669.17689 | 0.002 |
| 667.24842 | 0.004 |
| 665.31996 | 0.005 |
| 663.3915 | 0.005 |
| 661.46303 | 0.003 |
| 659.53457 | 0.002 |
| 657.6061 | 0.002 |
| 655.67764 | 0.001 |
| 653.74918 | 0.001 |
| 651.82071 | 0.001 |
| 649.89225 | 0.001 |
| 647.96379 | 0.002 |
| 646.03532 | 0.001 |
| 644.10686 | 0.001 |
| 642.1784 | 0.001 |
| 640.24993 | 0.001 |
| 638.32147 | 0 |
| 636.393 | 0 |
| 634.46454 | 0.001 |
| 632.53608 | 0.003 |
| 630.60761 | 0.006 |
| 628.67915 | 0.008 |
| 626.75069 | 0.008 |
| 624.82222 | 0.008 |
| 622.89376 | 0.006 |
| 620.96529 | 0.004 |
| 619.03683 | 0.004 |
| 617.10837 | 0.008 |
| 615.1799 | 0.013 |
| 613.25144 | 0.018 |
| 611.32298 | 0.022 |
| 609.39451 | 0.023 |
| 607.46605 | 0.022 |
| 605.53759 | 0.02 |
| 603.60912 | 0.017 |
| 601.68066 | 0.015 |
| 599.75219 | 0.013 |
| 597.82373 | 0.012 |
| 595.89527 | 0.011 |
| 593.9668 | 0.009 |
| 592.03834 | 0.008 |
| 590.10988 | 0.007 |
| 588.18141 | 0.006 |
| 586.25295 | 0.004 |
| 584.32449 | 0.003 |
| 582.39602 | 0.003 |
| 580.46756 | 0.002 |
| 578.53909 | 0.003 |
| 576.61063 | 0.004 |
| 574.68217 | 0.005 |
| 572.7537 | 0.006 |
| 570.82524 | 0.007 |
| 568.89678 | 0.01 |
| 566.96831 | 0.012 |
| 565.03985 | 0.011 |
| 563.11139 | 0.009 |
| 561.18292 | 0.007 |
| 559.25446 | 0.005 |
| 557.32599 | 0.003 |
| 555.39753 | 0.002 |
| 553.46907 | 0.002 |
| 551.5406 | 0.003 |
| 549.61214 | 0.003 |
| 547.68368 | 0.003 |
| 545.75521 | 0.003 |
| 543.82675 | 0.003 |
| 541.89829 | 0.002 |
| 539.96982 | 0.002 |
| 538.04136 | 0.002 |
| 536.11289 | 0.003 |
| 534.18443 | 0.004 |
| 532.25597 | 0.006 |
| 530.3275 | 0.008 |
| 528.39904 | 0.009 |
| 526.47058 | 0.01 |
| 524.54211 | 0.009 |
| 522.61365 | 0.008 |
| 520.68519 | 0.007 |
| 518.75672 | 0.005 |
| 516.82826 | 0.005 |
| 514.89979 | 0.004 |
| 512.97133 | 0.002 |
| 511.04287 | 0.002 |
| 509.1144 | 0.003 |
| 507.18594 | 0.002 |
| 505.25748 | 0.002 |
| 503.32901 | 0 |
| 501.40055 | 0 |
| 499.47209 | 0 |